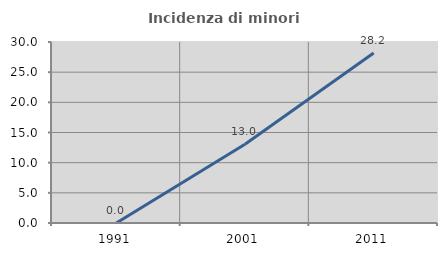
| Category | Incidenza di minori stranieri |
|---|---|
| 1991.0 | 0 |
| 2001.0 | 13.043 |
| 2011.0 | 28.169 |